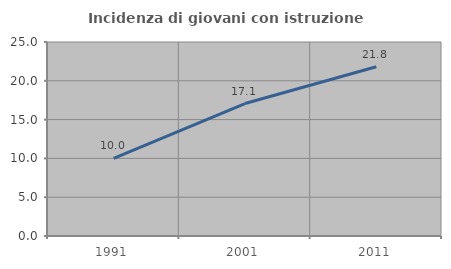
| Category | Incidenza di giovani con istruzione universitaria |
|---|---|
| 1991.0 | 10 |
| 2001.0 | 17.073 |
| 2011.0 | 21.818 |